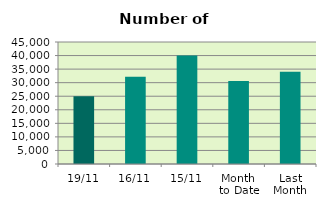
| Category | Series 0 |
|---|---|
| 19/11 | 24984 |
| 16/11 | 32196 |
| 15/11 | 40056 |
| Month 
to Date | 30587.385 |
| Last
Month | 34034.348 |